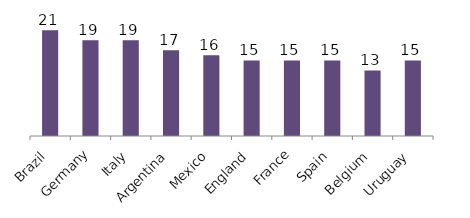
| Category | Appearances |
|---|---|
| Brazil | 21 |
| Germany | 19 |
| Italy | 19 |
| Argentina | 17 |
| Mexico | 16 |
| England | 15 |
| France | 15 |
| Spain | 15 |
| Belgium | 13 |
| Uruguay | 15 |